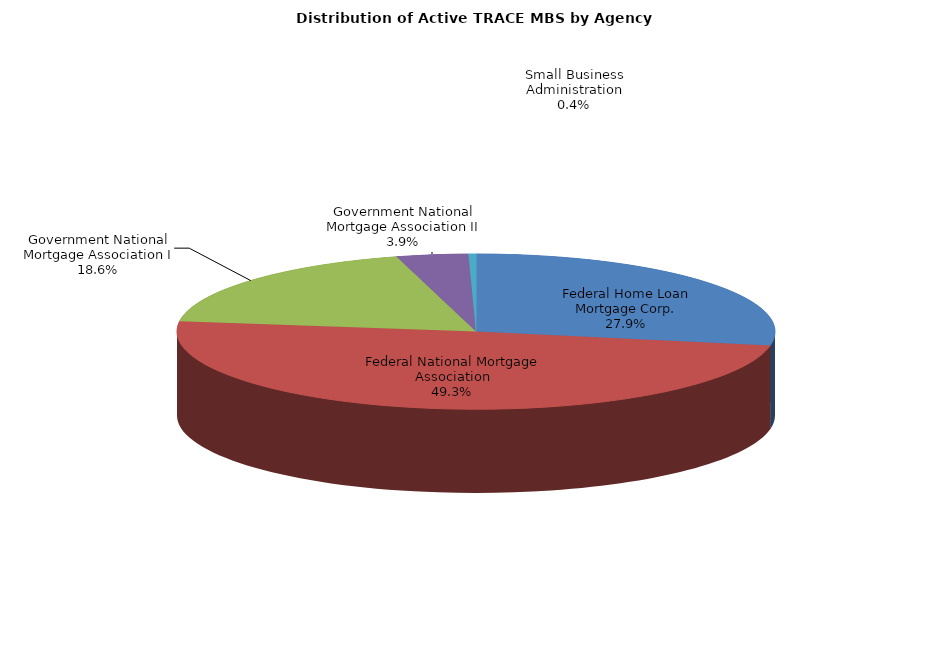
| Category | Series 0 |
|---|---|
| Federal Home Loan Mortgage Corp. | 298316 |
| Federal National Mortgage Association | 527236 |
| Government National Mortgage Association I | 199076 |
| Government National Mortgage Association II | 41489 |
| Small Business Administration | 4338 |